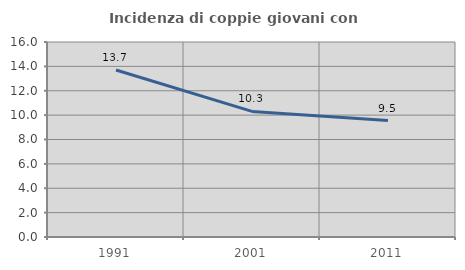
| Category | Incidenza di coppie giovani con figli |
|---|---|
| 1991.0 | 13.707 |
| 2001.0 | 10.306 |
| 2011.0 | 9.549 |